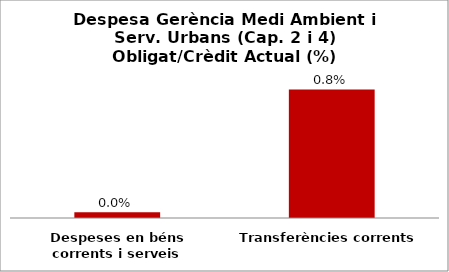
| Category | Series 0 |
|---|---|
| Despeses en béns corrents i serveis | 0 |
| Transferències corrents | 0.008 |